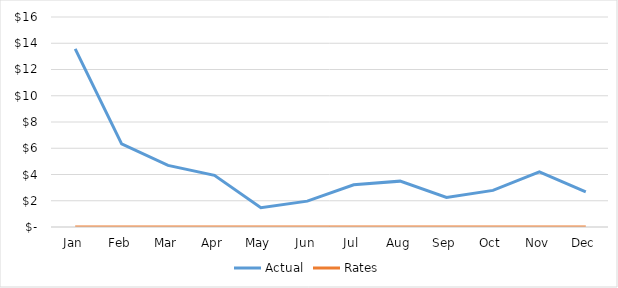
| Category | Actual | Rates |
|---|---|---|
|  Jan  | 13.576 | 0 |
|  Feb  | 6.336 | 0 |
|  Mar  | 4.69 | 0 |
|  Apr  | 3.938 | 0 |
|  May  | 1.468 | 0 |
|  Jun  | 1.97 | 0 |
|  Jul  | 3.218 | 0 |
|  Aug  | 3.494 | 0 |
|  Sep  | 2.251 | 0 |
|  Oct  | 2.792 | 0 |
|  Nov  | 4.202 | 0 |
|  Dec  | 2.669 | 0 |